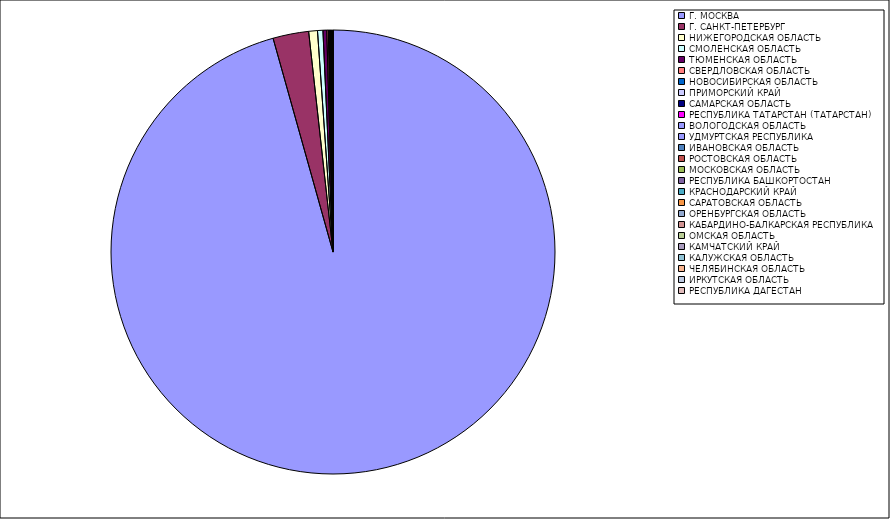
| Category | Оборот |
|---|---|
| Г. МОСКВА | 95.592 |
| Г. САНКТ-ПЕТЕРБУРГ | 2.599 |
| НИЖЕГОРОДСКАЯ ОБЛАСТЬ | 0.636 |
| СМОЛЕНСКАЯ ОБЛАСТЬ | 0.391 |
| ТЮМЕНСКАЯ ОБЛАСТЬ | 0.274 |
| СВЕРДЛОВСКАЯ ОБЛАСТЬ | 0.111 |
| НОВОСИБИРСКАЯ ОБЛАСТЬ | 0.054 |
| ПРИМОРСКИЙ КРАЙ | 0.049 |
| САМАРСКАЯ ОБЛАСТЬ | 0.048 |
| РЕСПУБЛИКА ТАТАРСТАН (ТАТАРСТАН) | 0.028 |
| ВОЛОГОДСКАЯ ОБЛАСТЬ | 0.018 |
| УДМУРТСКАЯ РЕСПУБЛИКА | 0.017 |
| ИВАНОВСКАЯ ОБЛАСТЬ | 0.014 |
| РОСТОВСКАЯ ОБЛАСТЬ | 0.014 |
| МОСКОВСКАЯ ОБЛАСТЬ | 0.013 |
| РЕСПУБЛИКА БАШКОРТОСТАН | 0.012 |
| КРАСНОДАРСКИЙ КРАЙ | 0.012 |
| САРАТОВСКАЯ ОБЛАСТЬ | 0.009 |
| ОРЕНБУРГСКАЯ ОБЛАСТЬ | 0.007 |
| КАБАРДИНО-БАЛКАРСКАЯ РЕСПУБЛИКА | 0.007 |
| ОМСКАЯ ОБЛАСТЬ | 0.007 |
| КАМЧАТСКИЙ КРАЙ | 0.006 |
| КАЛУЖСКАЯ ОБЛАСТЬ | 0.006 |
| ЧЕЛЯБИНСКАЯ ОБЛАСТЬ | 0.006 |
| ИРКУТСКАЯ ОБЛАСТЬ | 0.006 |
| РЕСПУБЛИКА ДАГЕСТАН | 0.005 |